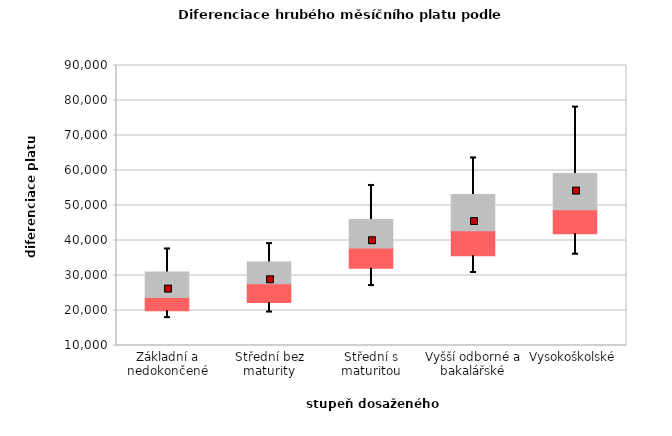
| Category | 0.25 | 0.5 | 0.75 |
|---|---|---|---|
| Základní a nedokončené | 19940.446 | 3795.721 | 7268.159 |
| Střední bez maturity | 22267.5 | 5340.929 | 6264.807 |
| Střední s maturitou | 32081.475 | 5745.793 | 8158.736 |
| Vyšší odborné a bakalářské | 35649.032 | 7169.942 | 10291.152 |
| Vysokoškolské | 41897.917 | 6872.645 | 10407.957 |